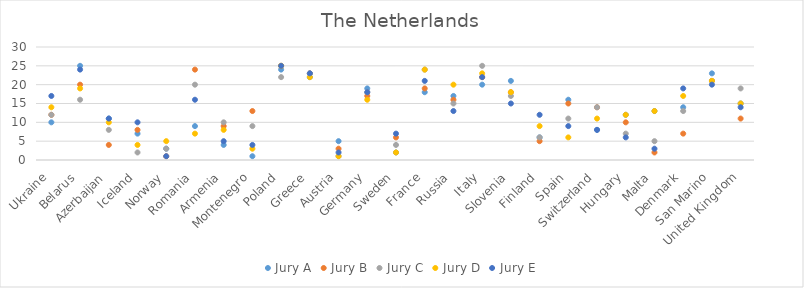
| Category | Jury A | Jury B | Jury C | Jury D | Jury E |
|---|---|---|---|---|---|
| Ukraine | 10 | 12 | 12 | 14 | 17 |
| Belarus | 25 | 20 | 16 | 19 | 24 |
| Azerbaijan | 11 | 4 | 8 | 10 | 11 |
| Iceland | 7 | 8 | 2 | 4 | 10 |
| Norway | 3 | 1 | 3 | 5 | 1 |
| Romania | 9 | 24 | 20 | 7 | 16 |
| Armenia | 4 | 9 | 10 | 8 | 5 |
| Montenegro | 1 | 13 | 9 | 3 | 4 |
| Poland | 24 | 25 | 22 | 25 | 25 |
| Greece | 22 | 23 | 23 | 22 | 23 |
| Austria | 5 | 3 | 1 | 1 | 2 |
| Germany | 19 | 17 | 18 | 16 | 18 |
| Sweden | 2 | 6 | 4 | 2 | 7 |
| France | 18 | 19 | 24 | 24 | 21 |
| Russia | 17 | 16 | 15 | 20 | 13 |
| Italy | 20 | 22 | 25 | 23 | 22 |
| Slovenia | 21 | 18 | 17 | 18 | 15 |
| Finland | 6 | 5 | 6 | 9 | 12 |
| Spain | 16 | 15 | 11 | 6 | 9 |
| Switzerland | 8 | 14 | 14 | 11 | 8 |
| Hungary | 12 | 10 | 7 | 12 | 6 |
| Malta | 13 | 2 | 5 | 13 | 3 |
| Denmark | 14 | 7 | 13 | 17 | 19 |
| San Marino | 23 | 21 | 21 | 21 | 20 |
| United Kingdom | 15 | 11 | 19 | 15 | 14 |